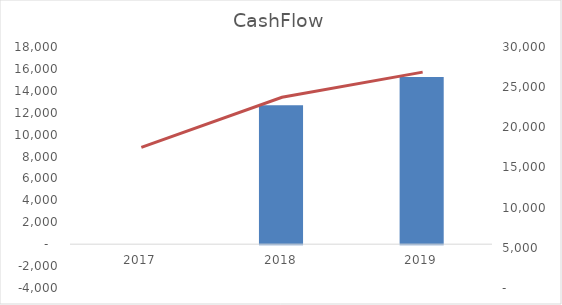
| Category | Series 0 |
|---|---|
| 2017.0 | -1235.429 |
| 2018.0 | 12691.133 |
| 2019.0 | 15261.691 |